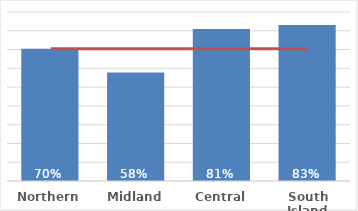
| Category | Māori |
|---|---|
| Northern | 0.704 |
| Midland | 0.578 |
| Central | 0.81 |
| South Island | 0.831 |